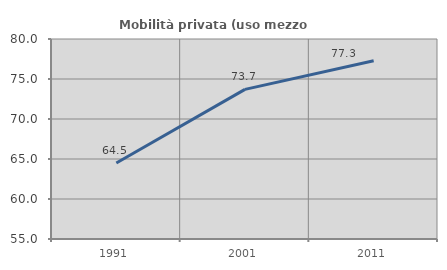
| Category | Mobilità privata (uso mezzo privato) |
|---|---|
| 1991.0 | 64.503 |
| 2001.0 | 73.704 |
| 2011.0 | 77.285 |